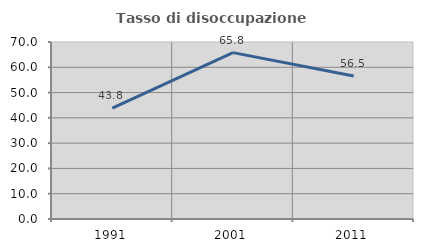
| Category | Tasso di disoccupazione giovanile  |
|---|---|
| 1991.0 | 43.81 |
| 2001.0 | 65.789 |
| 2011.0 | 56.522 |